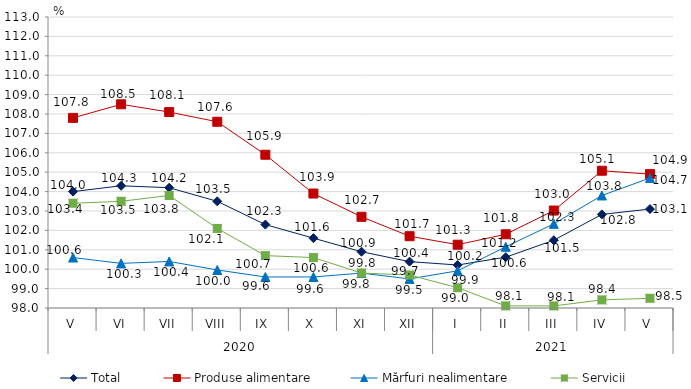
| Category | Total  | Produse alimentare | Mărfuri nealimentare  | Servicii |
|---|---|---|---|---|
| 0 | 104 | 107.8 | 100.6 | 103.4 |
| 1 | 104.3 | 108.5 | 100.3 | 103.5 |
| 2 | 104.2 | 108.1 | 100.4 | 103.8 |
| 3 | 103.5 | 107.6 | 99.96 | 102.1 |
| 4 | 102.3 | 105.9 | 99.6 | 100.7 |
| 5 | 101.6 | 103.9 | 99.6 | 100.6 |
| 6 | 100.9 | 102.7 | 99.8 | 99.8 |
| 7 | 100.39 | 101.7 | 99.5 | 99.7 |
| 8 | 100.216 | 101.263 | 99.917 | 99.046 |
| 9 | 100.619 | 101.8 | 101.154 | 98.109 |
| 10 | 101.493 | 103.024 | 102.337 | 98.107 |
| 11 | 102.826 | 105.075 | 103.801 | 98.417 |
| 12 | 103.1 | 104.9 | 104.7 | 98.5 |